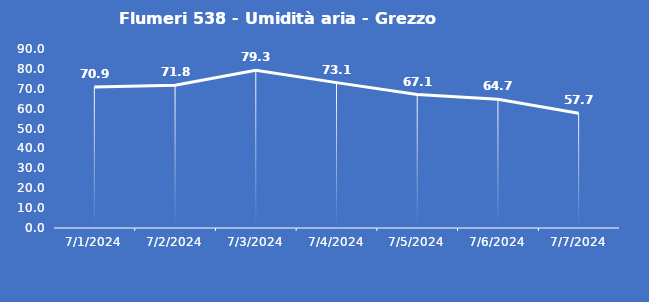
| Category | Flumeri 538 - Umidità aria - Grezzo (%) |
|---|---|
| 7/1/24 | 70.9 |
| 7/2/24 | 71.8 |
| 7/3/24 | 79.3 |
| 7/4/24 | 73.1 |
| 7/5/24 | 67.1 |
| 7/6/24 | 64.7 |
| 7/7/24 | 57.7 |